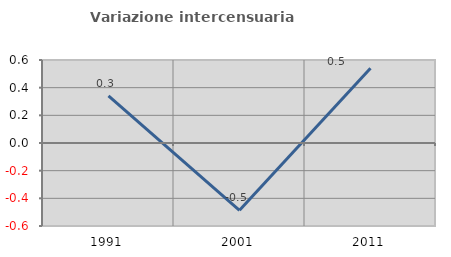
| Category | Variazione intercensuaria annua |
|---|---|
| 1991.0 | 0.34 |
| 2001.0 | -0.487 |
| 2011.0 | 0.541 |